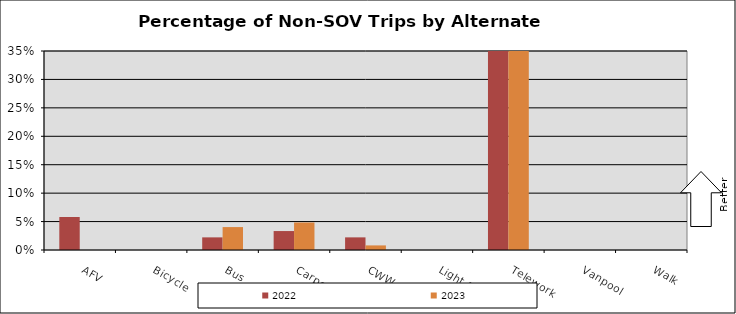
| Category | 2022 | 2023 |
|---|---|---|
| AFV | 0.058 | 0 |
| Bicycle | 0 | 0 |
| Bus | 0.022 | 0.04 |
| Carpool | 0.033 | 0.048 |
| CWW | 0.022 | 0.008 |
| Light Rail | 0 | 0 |
| Telework | 0.489 | 0.637 |
| Vanpool | 0 | 0 |
| Walk | 0 | 0 |